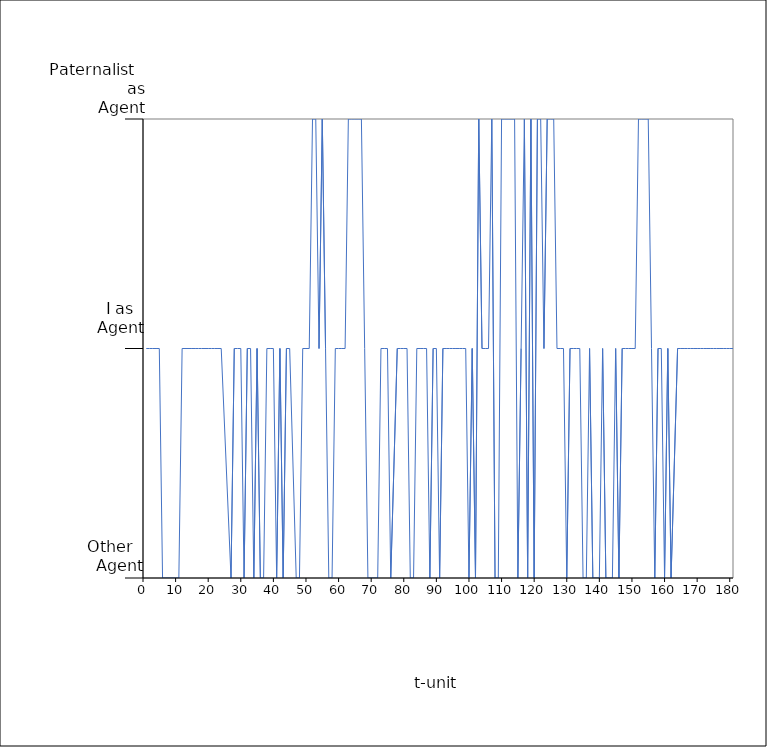
| Category | Series 0 |
|---|---|
| 0 | 1 |
| 1 | 1 |
| 2 | 1 |
| 3 | 1 |
| 4 | 1 |
| 5 | 0 |
| 6 | 0 |
| 7 | 0 |
| 8 | 0 |
| 9 | 1 |
| 10 | 1 |
| 11 | 1 |
| 12 | 1 |
| 13 | 1 |
| 14 | 1 |
| 15 | 1 |
| 16 | 1 |
| 17 | 1 |
| 18 | 1 |
| 19 | 0 |
| 20 | 1 |
| 21 | 1 |
| 22 | 1 |
| 23 | 0 |
| 24 | 1 |
| 25 | 1 |
| 26 | 0 |
| 27 | 1 |
| 28 | 0 |
| 29 | 0 |
| 30 | 1 |
| 31 | 1 |
| 32 | 1 |
| 33 | 0 |
| 34 | 1 |
| 35 | 0 |
| 36 | 1 |
| 37 | 1 |
| 38 | 0 |
| 39 | 0 |
| 40 | 1 |
| 41 | 1 |
| 42 | 1 |
| 43 | 2 |
| 44 | 2 |
| 45 | 1 |
| 46 | 2 |
| 47 | 1 |
| 48 | 0 |
| 49 | 0 |
| 50 | 1 |
| 51 | 1 |
| 52 | 1 |
| 53 | 1 |
| 54 | 2 |
| 55 | 2 |
| 56 | 2 |
| 57 | 2 |
| 58 | 2 |
| 59 | 1 |
| 60 | 0 |
| 61 | 0 |
| 62 | 0 |
| 63 | 1 |
| 64 | 1 |
| 65 | 1 |
| 66 | 0 |
| 67 | 1 |
| 68 | 1 |
| 69 | 1 |
| 70 | 1 |
| 71 | 0 |
| 72 | 0 |
| 73 | 1 |
| 74 | 1 |
| 75 | 1 |
| 76 | 1 |
| 77 | 0 |
| 78 | 1 |
| 79 | 1 |
| 80 | 0 |
| 81 | 1 |
| 82 | 1 |
| 83 | 1 |
| 84 | 1 |
| 85 | 1 |
| 86 | 1 |
| 87 | 1 |
| 88 | 1 |
| 89 | 0 |
| 90 | 1 |
| 91 | 0 |
| 92 | 2 |
| 93 | 1 |
| 94 | 1 |
| 95 | 1 |
| 96 | 2 |
| 97 | 0 |
| 98 | 0 |
| 99 | 2 |
| 100 | 2 |
| 101 | 2 |
| 102 | 2 |
| 103 | 0 |
| 104 | 1 |
| 105 | 2 |
| 106 | 0 |
| 107 | 2 |
| 108 | 0 |
| 109 | 2 |
| 110 | 2 |
| 111 | 1 |
| 112 | 2 |
| 113 | 2 |
| 114 | 2 |
| 115 | 1 |
| 116 | 1 |
| 117 | 1 |
| 118 | 0 |
| 119 | 1 |
| 120 | 1 |
| 121 | 1 |
| 122 | 1 |
| 123 | 0 |
| 124 | 0 |
| 125 | 1 |
| 126 | 0 |
| 127 | 0 |
| 128 | 0 |
| 129 | 1 |
| 130 | 0 |
| 131 | 0 |
| 132 | 0 |
| 133 | 1 |
| 134 | 0 |
| 135 | 1 |
| 136 | 1 |
| 137 | 1 |
| 138 | 1 |
| 139 | 1 |
| 140 | 2 |
| 141 | 2 |
| 142 | 2 |
| 143 | 2 |
| 144 | 1 |
| 145 | 0 |
| 146 | 1 |
| 147 | 1 |
| 148 | 0 |
| 149 | 1 |
| 150 | 0 |
| 151 | 1 |
| 152 | 1 |
| 153 | 1 |
| 154 | 1 |
| 155 | 1 |
| 156 | 1 |
| 157 | 1 |
| 158 | 1 |
| 159 | 1 |
| 160 | 1 |
| 161 | 1 |
| 162 | 1 |
| 163 | 1 |
| 164 | 1 |
| 165 | 1 |
| 166 | 1 |
| 167 | 1 |
| 168 | 1 |